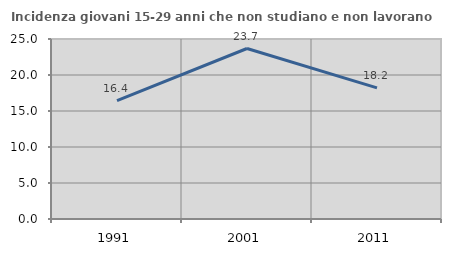
| Category | Incidenza giovani 15-29 anni che non studiano e non lavorano  |
|---|---|
| 1991.0 | 16.438 |
| 2001.0 | 23.678 |
| 2011.0 | 18.212 |